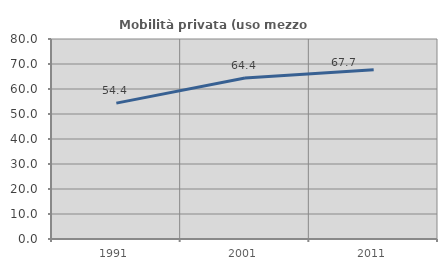
| Category | Mobilità privata (uso mezzo privato) |
|---|---|
| 1991.0 | 54.357 |
| 2001.0 | 64.404 |
| 2011.0 | 67.717 |